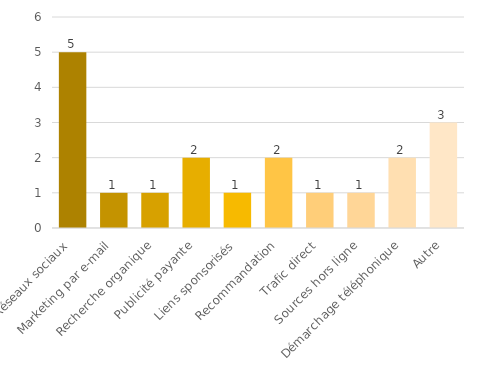
| Category | Series 0 |
|---|---|
| Réseaux sociaux | 5 |
| Marketing par e-mail | 1 |
| Recherche organique | 1 |
| Publicité payante | 2 |
| Liens sponsorisés | 1 |
| Recommandation | 2 |
| Trafic direct | 1 |
| Sources hors ligne | 1 |
| Démarchage téléphonique | 2 |
| Autre | 3 |